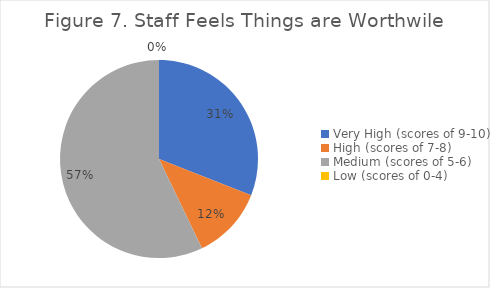
| Category | Series 0 |
|---|---|
| Very High (scores of 9-10) | 0.31 |
| High (scores of 7-8) | 0.119 |
| Medium (scores of 5-6) | 0.571 |
| Low (scores of 0-4) | 0 |